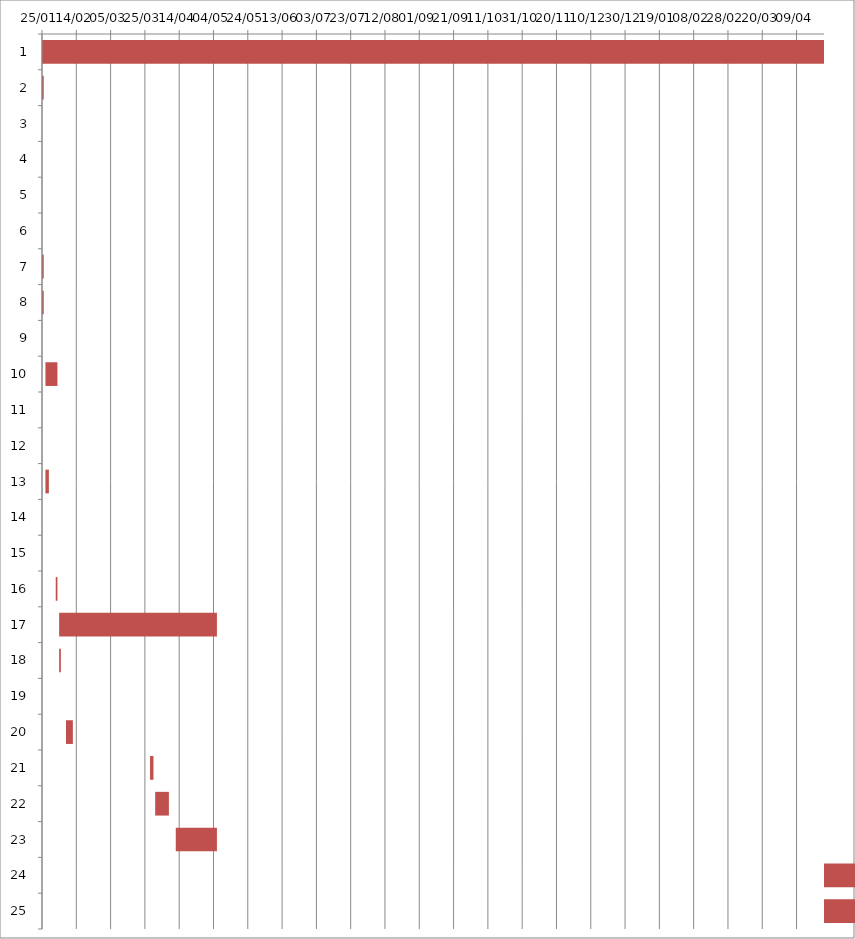
| Category | Fecha de inicio | DURACIÓN |
|---|---|---|
| 0 | 1/25/16 | 613 |
| 1 | 1/25/16 | 1 |
| 2 | 1/25/16 | 0 |
| 3 | 1/25/16 | 0 |
| 4 | 1/25/16 | 0 |
| 5 | 1/25/16 | 0 |
| 6 | 1/25/16 | 1 |
| 7 | 1/25/16 | 1 |
| 8 | 1/26/16 | 0 |
| 9 | 1/27/16 | 7 |
| 10 | 1/27/16 | 0 |
| 11 | 1/28/16 | 0 |
| 12 | 1/27/16 | 2 |
| 13 | 2/1/16 | 0 |
| 14 | 2/2/16 | 0 |
| 15 | 2/2/16 | 1 |
| 16 | 2/4/16 | 92 |
| 17 | 2/4/16 | 1 |
| 18 | 2/5/16 | 0 |
| 19 | 2/8/16 | 4 |
| 20 | 3/28/16 | 2 |
| 21 | 3/31/16 | 8 |
| 22 | 4/12/16 | 24 |
| 23 | 11/1/17 | 62 |
| 24 | 11/1/17 | 62 |